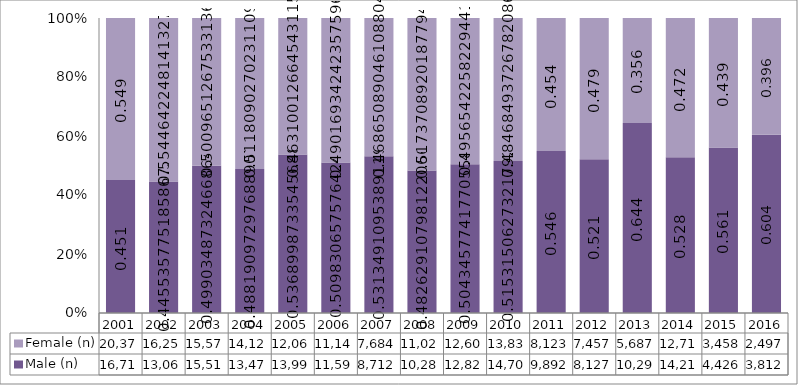
| Category | Male (n) | Female (n) |
|---|---|---|
| 2001.0 | 16711 | 20376 |
| 2002.0 | 13064 | 16258 |
| 2003.0 | 15512 | 15572 |
| 2004.0 | 13477 | 14129 |
| 2005.0 | 13990 | 12067 |
| 2006.0 | 11591 | 11144 |
| 2007.0 | 8712 | 7684 |
| 2008.0 | 10280 | 11020 |
| 2009.0 | 12824 | 12603 |
| 2010.0 | 14704 | 13830 |
| 2011.0 | 9892 | 8123 |
| 2012.0 | 8127 | 7457 |
| 2013.0 | 10294 | 5687 |
| 2014.0 | 14217 | 12717 |
| 2015.0 | 4426 | 3458 |
| 2016.0 | 3812 | 2497 |